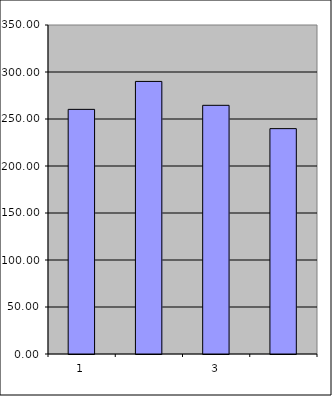
| Category | Series 0 |
|---|---|
| 0 | 260.25 |
| 1 | 289.962 |
| 2 | 264.546 |
| 3 | 239.756 |